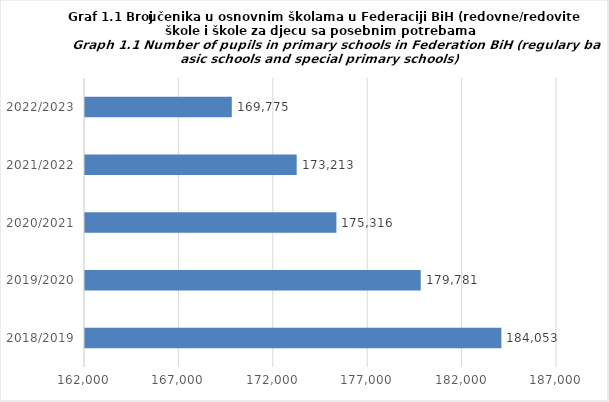
| Category | Series 0 |
|---|---|
| 2018/2019 | 184053 |
| 2019/2020 | 179781 |
| 2020/2021 | 175316 |
| 2021/2022 | 173213 |
| 2022/2023 | 169775 |